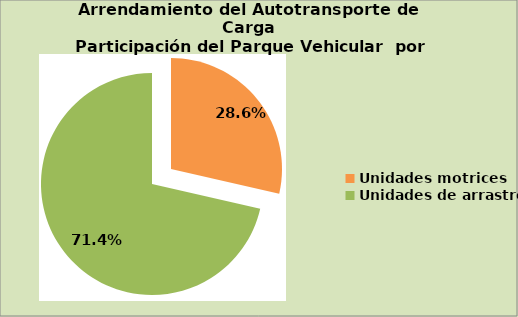
| Category | Series 0 |
|---|---|
| Unidades motrices | 28.572 |
| Unidades de arrastre | 71.428 |